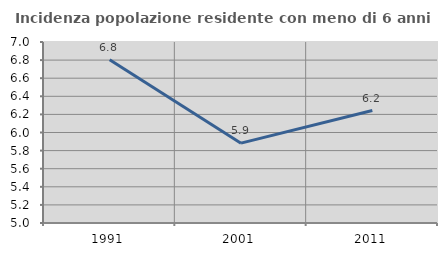
| Category | Incidenza popolazione residente con meno di 6 anni |
|---|---|
| 1991.0 | 6.805 |
| 2001.0 | 5.882 |
| 2011.0 | 6.243 |